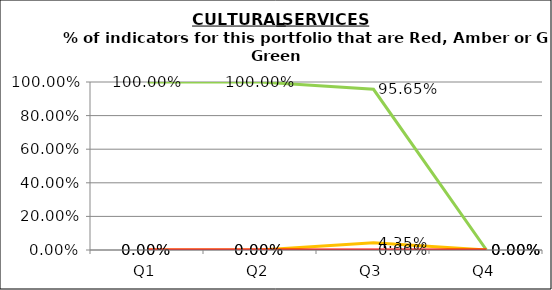
| Category | Green | Amber | Red |
|---|---|---|---|
| Q1 | 1 | 0 | 0 |
| Q2 | 1 | 0 | 0 |
| Q3 | 0.957 | 0.043 | 0 |
| Q4 | 0 | 0 | 0 |